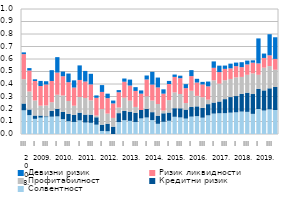
| Category | Солвентност | Кредитни ризик | Профитабилност | Ризик ликвидности | Девизни ризик |
|---|---|---|---|---|---|
| 0 | 0.19 | 0.054 | 0.195 | 0.2 | 0.014 |
| 1 | 0.151 | 0.045 | 0.145 | 0.168 | 0.019 |
| 2 | 0.121 | 0.027 | 0.12 | 0.156 | 0.014 |
| 3 | 0.131 | 0.017 | 0.079 | 0.158 | 0.041 |
| 4 | 0.135 | 0.007 | 0.087 | 0.168 | 0.026 |
| 5 | 0.139 | 0.047 | 0.069 | 0.17 | 0.086 |
| 6 | 0.141 | 0.06 | 0.113 | 0.178 | 0.123 |
| 7 | 0.118 | 0.058 | 0.132 | 0.154 | 0.038 |
| 8 | 0.102 | 0.059 | 0.103 | 0.15 | 0.069 |
| 9 | 0.096 | 0.056 | 0.074 | 0.145 | 0.058 |
| 10 | 0.109 | 0.062 | 0.126 | 0.136 | 0.116 |
| 11 | 0.092 | 0.064 | 0.133 | 0.132 | 0.085 |
| 12 | 0.089 | 0.065 | 0.114 | 0.128 | 0.085 |
| 13 | 0.075 | 0.059 | 0.013 | 0.142 | 0.019 |
| 14 | 0.024 | 0.05 | 0.125 | 0.137 | 0.055 |
| 15 | 0.022 | 0.06 | 0.081 | 0.123 | 0.036 |
| 16 | 0 | 0.059 | 0.07 | 0.116 | 0.023 |
| 17 | 0.096 | 0.071 | 0.045 | 0.122 | 0.017 |
| 18 | 0.111 | 0.075 | 0.105 | 0.128 | 0.025 |
| 19 | 0.105 | 0.074 | 0.088 | 0.121 | 0.047 |
| 20 | 0.096 | 0.072 | 0.048 | 0.128 | 0.03 |
| 21 | 0.125 | 0.067 | 0 | 0.131 | 0.026 |
| 22 | 0.132 | 0.068 | 0.102 | 0.135 | 0.032 |
| 23 | 0.111 | 0.064 | 0.093 | 0.128 | 0.102 |
| 24 | 0.082 | 0.065 | 0.094 | 0.132 | 0.079 |
| 25 | 0.098 | 0.068 | 0.022 | 0.135 | 0.035 |
| 26 | 0.106 | 0.066 | 0.099 | 0.129 | 0.025 |
| 27 | 0.138 | 0.069 | 0.127 | 0.123 | 0.019 |
| 28 | 0.133 | 0.073 | 0.115 | 0.126 | 0.02 |
| 29 | 0.123 | 0.071 | 0.052 | 0.12 | 0.032 |
| 30 | 0.139 | 0.077 | 0.13 | 0.118 | 0.048 |
| 31 | 0.143 | 0.078 | 0.084 | 0.107 | 0.03 |
| 32 | 0.131 | 0.079 | 0.085 | 0.103 | 0.02 |
| 33 | 0.149 | 0.09 | 0.036 | 0.106 | 0.039 |
| 34 | 0.163 | 0.088 | 0.178 | 0.1 | 0.051 |
| 35 | 0.166 | 0.094 | 0.143 | 0.093 | 0.051 |
| 36 | 0.167 | 0.112 | 0.151 | 0.091 | 0.027 |
| 37 | 0.171 | 0.125 | 0.145 | 0.085 | 0.038 |
| 38 | 0.174 | 0.13 | 0.149 | 0.09 | 0.028 |
| 39 | 0.179 | 0.142 | 0.135 | 0.078 | 0.039 |
| 40 | 0.177 | 0.154 | 0.143 | 0.083 | 0.031 |
| 41 | 0.161 | 0.159 | 0.165 | 0.086 | 0.019 |
| 42 | 0.2 | 0.162 | 0.112 | 0.091 | 0.2 |
| 43 | 0.188 | 0.161 | 0.182 | 0.078 | 0.035 |
| 44 | 0.197 | 0.168 | 0.178 | 0.086 | 0.169 |
| 45 | 0.192 | 0.184 | 0.138 | 0.087 | 0.173 |